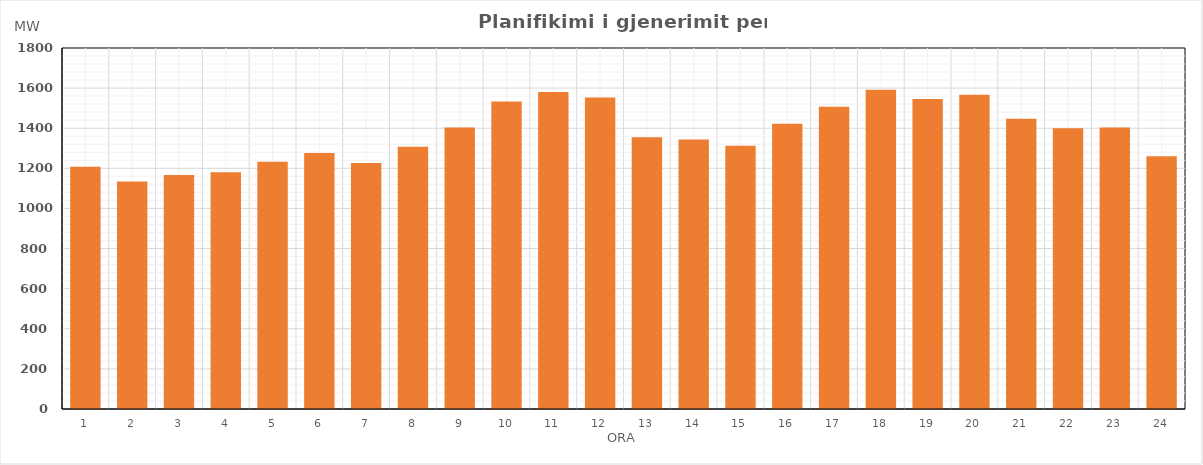
| Category | Max (MW) |
|---|---|
| 0 | 1208.106 |
| 1 | 1134.213 |
| 2 | 1166.368 |
| 3 | 1180.882 |
| 4 | 1233.354 |
| 5 | 1276.729 |
| 6 | 1226.327 |
| 7 | 1307.408 |
| 8 | 1404.064 |
| 9 | 1532.692 |
| 10 | 1580.016 |
| 11 | 1553.471 |
| 12 | 1355.214 |
| 13 | 1344.279 |
| 14 | 1312.474 |
| 15 | 1421.777 |
| 16 | 1507.279 |
| 17 | 1591.402 |
| 18 | 1545.325 |
| 19 | 1567.502 |
| 20 | 1447.607 |
| 21 | 1399.33 |
| 22 | 1404.156 |
| 23 | 1260.536 |